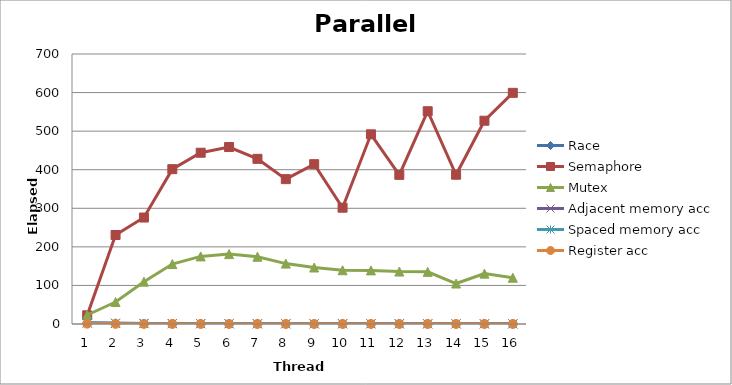
| Category | Race | Semaphore | Mutex | Adjacent memory acc | Spaced memory acc | Register acc |
|---|---|---|---|---|---|---|
| 0 | 2.46 | 22.56 | 23.36 | 2.47 | 2.53 | 0.82 |
| 1 | 1.94 | 230.76 | 56.97 | 2.07 | 1.27 | 0.41 |
| 2 | 1.4 | 276.02 | 109.73 | 1.5 | 0.82 | 0.27 |
| 3 | 1.31 | 401.44 | 155.4 | 1.19 | 0.62 | 0.21 |
| 4 | 1.05 | 444 | 175.27 | 1 | 0.53 | 0.17 |
| 5 | 1.02 | 458.8 | 181.17 | 0.83 | 0.43 | 0.15 |
| 6 | 0.96 | 428.21 | 174.41 | 0.63 | 0.37 | 0.13 |
| 7 | 0.9 | 375.56 | 156.6 | 0.63 | 0.33 | 0.12 |
| 8 | 0.92 | 414.38 | 146.46 | 0.56 | 0.3 | 0.14 |
| 9 | 0.91 | 301.51 | 139.39 | 0.74 | 0.28 | 0.13 |
| 10 | 0.91 | 491.76 | 139 | 0.71 | 0.25 | 0.12 |
| 11 | 0.89 | 386.66 | 135.95 | 0.66 | 0.24 | 0.13 |
| 12 | 0.86 | 551.62 | 135.16 | 0.62 | 0.21 | 0.12 |
| 13 | 0.86 | 386.97 | 104.93 | 0.59 | 0.2 | 0.12 |
| 14 | 0.88 | 527 | 130.6 | 0.52 | 0.19 | 0.11 |
| 15 | 0.86 | 599.33 | 119.94 | 0.49 | 0.29 | 0.15 |